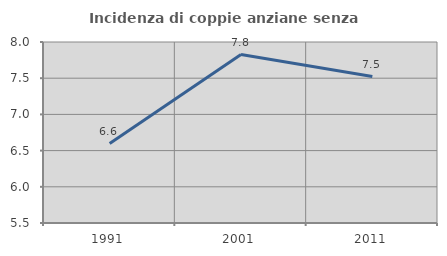
| Category | Incidenza di coppie anziane senza figli  |
|---|---|
| 1991.0 | 6.597 |
| 2001.0 | 7.826 |
| 2011.0 | 7.522 |